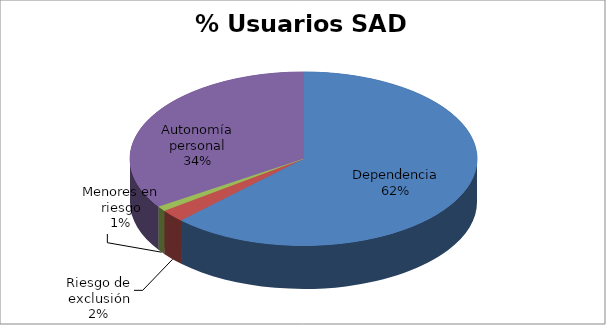
| Category | Series 0 |
|---|---|
| Dependencia | 2254 |
| Riesgo de exclusión | 84 |
| Menores en riesgo | 34 |
| Autonomía personal | 1238 |